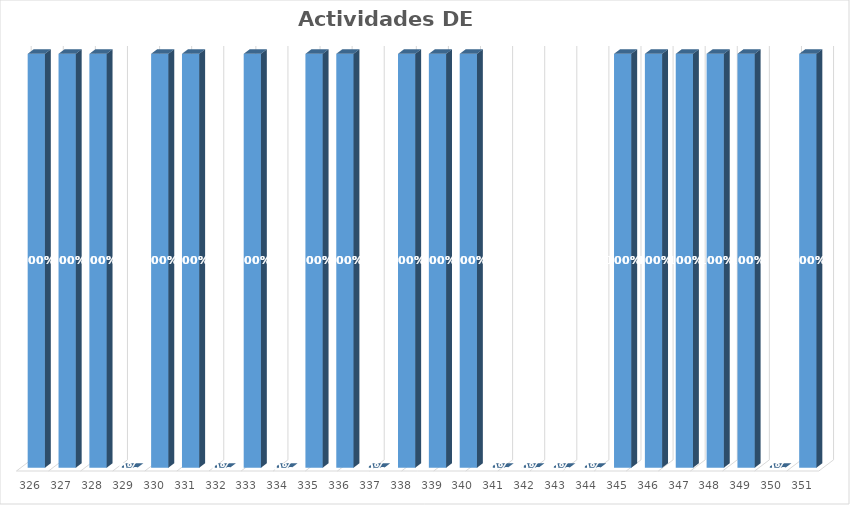
| Category | % Avance |
|---|---|
| 326.0 | 1 |
| 327.0 | 1 |
| 328.0 | 1 |
| 329.0 | 0 |
| 330.0 | 1 |
| 331.0 | 1 |
| 332.0 | 0 |
| 333.0 | 1 |
| 334.0 | 0 |
| 335.0 | 1 |
| 336.0 | 1 |
| 337.0 | 0 |
| 338.0 | 1 |
| 339.0 | 1 |
| 340.0 | 1 |
| 341.0 | 0 |
| 342.0 | 0 |
| 343.0 | 0 |
| 344.0 | 0 |
| 345.0 | 1 |
| 346.0 | 1 |
| 347.0 | 1 |
| 348.0 | 1 |
| 349.0 | 1 |
| 350.0 | 0 |
| 351.0 | 1 |